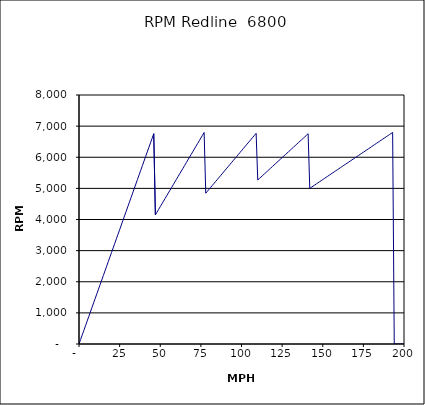
| Category | RPM Redline  6800 |
|---|---|
| 0.0 | 0 |
| 1.0 | 146.894 |
| 2.0 | 293.787 |
| 3.0 | 440.681 |
| 4.0 | 587.574 |
| 5.0 | 734.468 |
| 6.0 | 881.362 |
| 7.0 | 1028.255 |
| 8.0 | 1175.149 |
| 9.0 | 1322.042 |
| 10.0 | 1468.936 |
| 11.0 | 1615.83 |
| 12.0 | 1762.723 |
| 13.0 | 1909.617 |
| 14.0 | 2056.51 |
| 15.0 | 2203.404 |
| 16.0 | 2350.298 |
| 17.0 | 2497.191 |
| 18.0 | 2644.085 |
| 19.0 | 2790.978 |
| 20.0 | 2937.872 |
| 21.0 | 3084.766 |
| 22.0 | 3231.659 |
| 23.0 | 3378.553 |
| 24.0 | 3525.446 |
| 25.0 | 3672.34 |
| 26.0 | 3819.234 |
| 27.0 | 3966.127 |
| 28.0 | 4113.021 |
| 29.0 | 4259.914 |
| 30.0 | 4406.808 |
| 31.0 | 4553.702 |
| 32.0 | 4700.595 |
| 33.0 | 4847.489 |
| 34.0 | 4994.382 |
| 35.0 | 5141.276 |
| 36.0 | 5288.17 |
| 37.0 | 5435.063 |
| 38.0 | 5581.957 |
| 39.0 | 5728.85 |
| 40.0 | 5875.744 |
| 41.0 | 6022.638 |
| 42.0 | 6169.531 |
| 43.0 | 6316.425 |
| 44.0 | 6463.318 |
| 45.0 | 6610.212 |
| 46.0 | 6757.106 |
| 47.0 | 4147.717 |
| 48.0 | 4235.966 |
| 49.0 | 4324.216 |
| 50.0 | 4412.465 |
| 51.0 | 4500.714 |
| 52.0 | 4588.964 |
| 53.0 | 4677.213 |
| 54.0 | 4765.462 |
| 55.0 | 4853.711 |
| 56.0 | 4941.961 |
| 57.0 | 5030.21 |
| 58.0 | 5118.459 |
| 59.0 | 5206.709 |
| 60.0 | 5294.958 |
| 61.0 | 5383.207 |
| 62.0 | 5471.457 |
| 63.0 | 5559.706 |
| 64.0 | 5647.955 |
| 65.0 | 5736.204 |
| 66.0 | 5824.454 |
| 67.0 | 5912.703 |
| 68.0 | 6000.952 |
| 69.0 | 6089.202 |
| 70.0 | 6177.451 |
| 71.0 | 6265.7 |
| 72.0 | 6353.95 |
| 73.0 | 6442.199 |
| 74.0 | 6530.448 |
| 75.0 | 6618.697 |
| 76.0 | 6706.947 |
| 77.0 | 6795.196 |
| 78.0 | 4843.906 |
| 79.0 | 4906.007 |
| 80.0 | 4968.109 |
| 81.0 | 5030.21 |
| 82.0 | 5092.311 |
| 83.0 | 5154.413 |
| 84.0 | 5216.514 |
| 85.0 | 5278.616 |
| 86.0 | 5340.717 |
| 87.0 | 5402.818 |
| 88.0 | 5464.92 |
| 89.0 | 5527.021 |
| 90.0 | 5589.122 |
| 91.0 | 5651.224 |
| 92.0 | 5713.325 |
| 93.0 | 5775.426 |
| 94.0 | 5837.528 |
| 95.0 | 5899.629 |
| 96.0 | 5961.73 |
| 97.0 | 6023.832 |
| 98.0 | 6085.933 |
| 99.0 | 6148.035 |
| 100.0 | 6210.136 |
| 101.0 | 6272.237 |
| 102.0 | 6334.339 |
| 103.0 | 6396.44 |
| 104.0 | 6458.541 |
| 105.0 | 6520.643 |
| 106.0 | 6582.744 |
| 107.0 | 6644.845 |
| 108.0 | 6706.947 |
| 109.0 | 6769.048 |
| 110.0 | 5269.744 |
| 111.0 | 5317.651 |
| 112.0 | 5365.557 |
| 113.0 | 5413.464 |
| 114.0 | 5461.371 |
| 115.0 | 5509.278 |
| 116.0 | 5557.184 |
| 117.0 | 5605.091 |
| 118.0 | 5652.998 |
| 119.0 | 5700.905 |
| 120.0 | 5748.812 |
| 121.0 | 5796.718 |
| 122.0 | 5844.625 |
| 123.0 | 5892.532 |
| 124.0 | 5940.439 |
| 125.0 | 5988.345 |
| 126.0 | 6036.252 |
| 127.0 | 6084.159 |
| 128.0 | 6132.066 |
| 129.0 | 6179.972 |
| 130.0 | 6227.879 |
| 131.0 | 6275.786 |
| 132.0 | 6323.693 |
| 133.0 | 6371.599 |
| 134.0 | 6419.506 |
| 135.0 | 6467.413 |
| 136.0 | 6515.32 |
| 137.0 | 6563.227 |
| 138.0 | 6611.133 |
| 139.0 | 6659.04 |
| 140.0 | 6706.947 |
| 141.0 | 6754.854 |
| 142.0 | 5000.674 |
| 143.0 | 5035.89 |
| 144.0 | 5071.106 |
| 145.0 | 5106.322 |
| 146.0 | 5141.538 |
| 147.0 | 5176.754 |
| 148.0 | 5211.97 |
| 149.0 | 5247.186 |
| 150.0 | 5282.402 |
| 151.0 | 5317.618 |
| 152.0 | 5352.834 |
| 153.0 | 5388.05 |
| 154.0 | 5423.266 |
| 155.0 | 5458.482 |
| 156.0 | 5493.698 |
| 157.0 | 5528.914 |
| 158.0 | 5564.13 |
| 159.0 | 5599.346 |
| 160.0 | 5634.562 |
| 161.0 | 5669.778 |
| 162.0 | 5704.994 |
| 163.0 | 5740.21 |
| 164.0 | 5775.426 |
| 165.0 | 5810.642 |
| 166.0 | 5845.858 |
| 167.0 | 5881.074 |
| 168.0 | 5916.29 |
| 169.0 | 5951.506 |
| 170.0 | 5986.722 |
| 171.0 | 6021.939 |
| 172.0 | 6057.155 |
| 173.0 | 6092.371 |
| 174.0 | 6127.587 |
| 175.0 | 6162.803 |
| 176.0 | 6198.019 |
| 177.0 | 6233.235 |
| 178.0 | 6268.451 |
| 179.0 | 6303.667 |
| 180.0 | 6338.883 |
| 181.0 | 6374.099 |
| 182.0 | 6409.315 |
| 183.0 | 6444.531 |
| 184.0 | 6479.747 |
| 185.0 | 6514.963 |
| 186.0 | 6550.179 |
| 187.0 | 6585.395 |
| 188.0 | 6620.611 |
| 189.0 | 6655.827 |
| 190.0 | 6691.043 |
| 191.0 | 6726.259 |
| 192.0 | 6761.475 |
| 193.0 | 6796.691 |
| 194.0 | 0 |
| 195.0 | 0 |
| 196.0 | 0 |
| 197.0 | 0 |
| 198.0 | 0 |
| 199.0 | 0 |
| 200.0 | 0 |